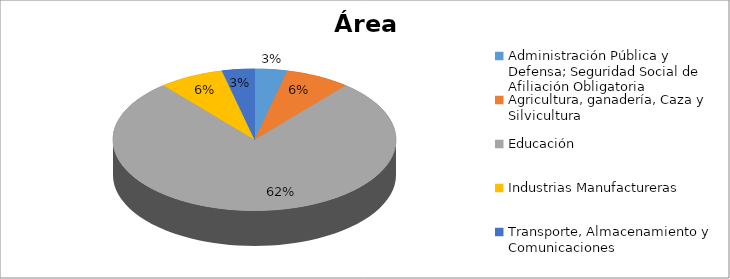
| Category | Series 0 |
|---|---|
| Administración Pública y Defensa; Seguridad Social de Afiliación Obligatoria | 0.029 |
| Agricultura, ganadería, Caza y Silvicultura | 0.059 |
| Educación | 0.618 |
| Industrias Manufactureras | 0.059 |
| Transporte, Almacenamiento y Comunicaciones | 0.029 |